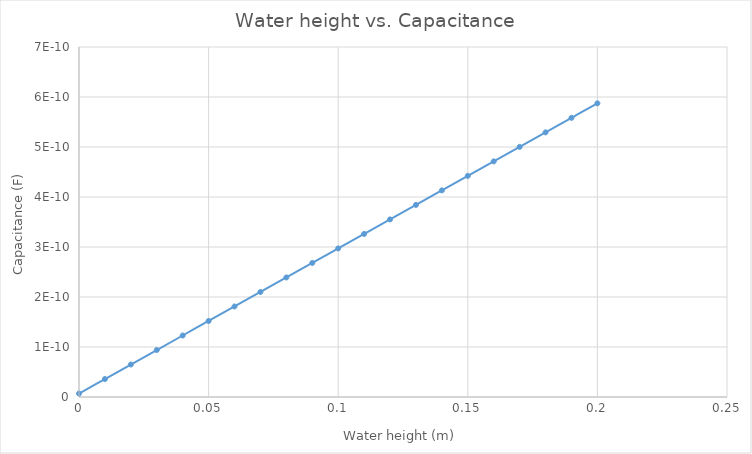
| Category | Series 0 |
|---|---|
| 0.0 | 0 |
| 0.01 | 0 |
| 0.02 | 0 |
| 0.03 | 0 |
| 0.04 | 0 |
| 0.05 | 0 |
| 0.06 | 0 |
| 0.07 | 0 |
| 0.08 | 0 |
| 0.09 | 0 |
| 0.1 | 0 |
| 0.11 | 0 |
| 0.12 | 0 |
| 0.13 | 0 |
| 0.14 | 0 |
| 0.15 | 0 |
| 0.16 | 0 |
| 0.17 | 0 |
| 0.18 | 0 |
| 0.19 | 0 |
| 0.2 | 0 |